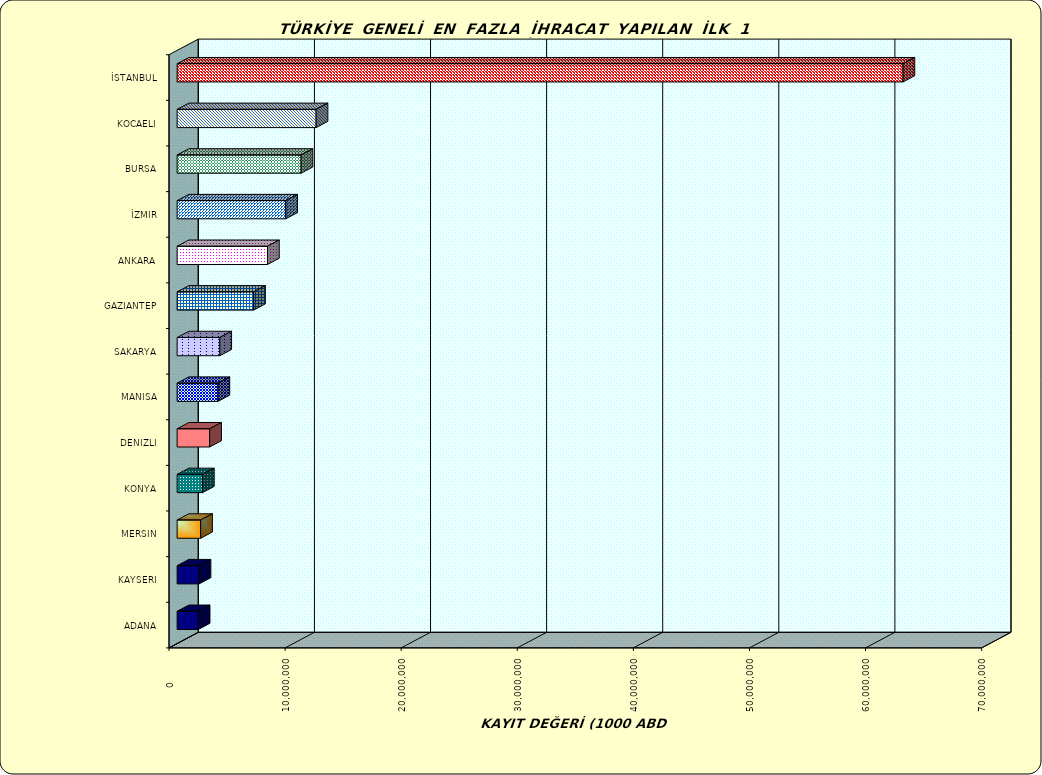
| Category | Series 0 |
|---|---|
| İSTANBUL | 62525097.901 |
| KOCAELI | 11971654.033 |
| BURSA | 10676893.504 |
| İZMIR | 9354825.674 |
| ANKARA | 7783472.262 |
| GAZIANTEP | 6589446.722 |
| SAKARYA | 3677341.545 |
| MANISA | 3517718.177 |
| DENIZLI | 2803202.212 |
| KONYA | 2180615.598 |
| MERSIN | 2026520.211 |
| KAYSERI | 1893873.396 |
| ADANA | 1815243.664 |